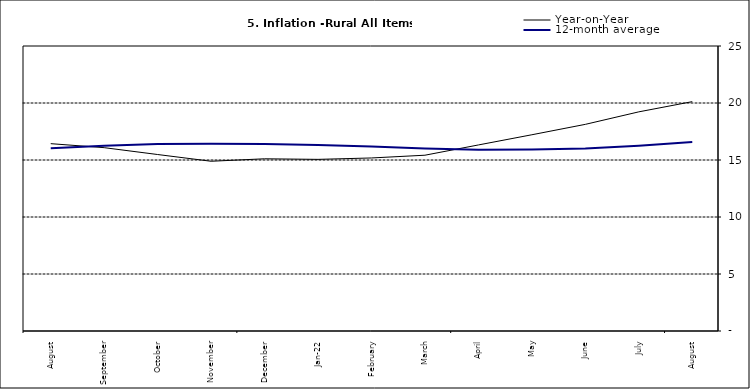
| Category | Year-on-Year | 12-month average |
|---|---|---|
| August | 16.433 | 16.03 |
| September | 16.081 | 16.26 |
| October | 15.48 | 16.393 |
| November | 14.89 | 16.419 |
| December | 15.106 | 16.397 |
| Jan-22 | 15.055 | 16.313 |
| February | 15.179 | 16.176 |
| March | 15.421 | 15.999 |
| April | 16.321 | 15.908 |
| May | 17.215 | 15.915 |
| June | 18.128 | 16.017 |
| July | 19.224 | 16.246 |
| August | 20.118 | 16.575 |